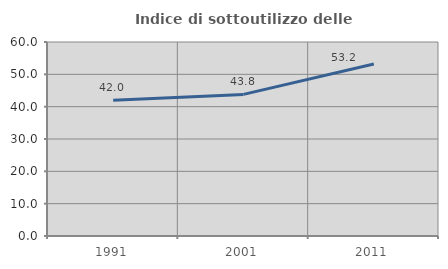
| Category | Indice di sottoutilizzo delle abitazioni  |
|---|---|
| 1991.0 | 41.97 |
| 2001.0 | 43.793 |
| 2011.0 | 53.186 |